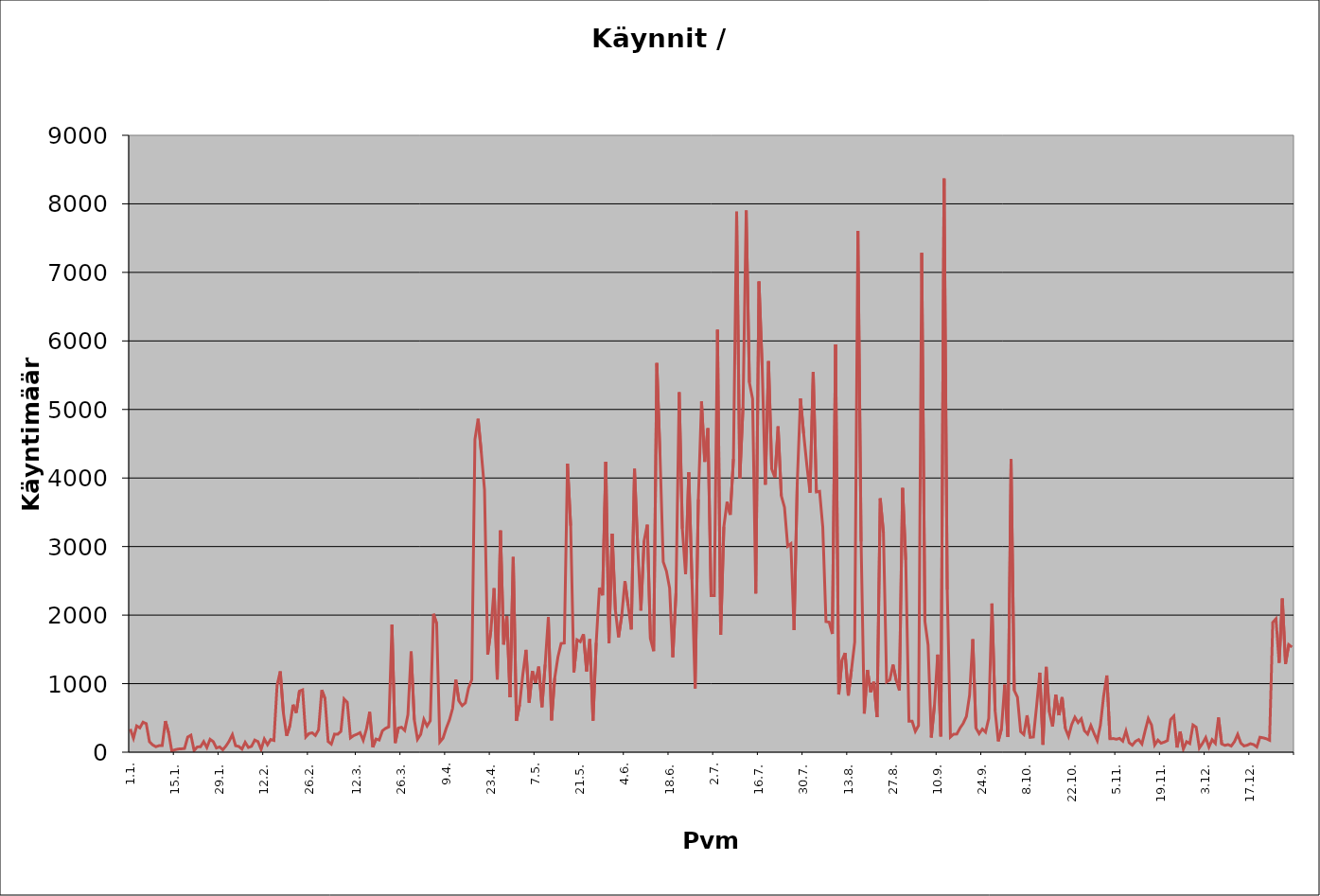
| Category | Series 1 |
|---|---|
| 0 | 338 |
| 1 | 204 |
| 2 | 383 |
| 3 | 355 |
| 4 | 438 |
| 5 | 416 |
| 6 | 154 |
| 7 | 107 |
| 8 | 80 |
| 9 | 95 |
| 10 | 96 |
| 11 | 454 |
| 12 | 286 |
| 13 | 19 |
| 14 | 35 |
| 15 | 46 |
| 16 | 49 |
| 17 | 54 |
| 18 | 221 |
| 19 | 248 |
| 20 | 25 |
| 21 | 77 |
| 22 | 79 |
| 23 | 154 |
| 24 | 68 |
| 25 | 188 |
| 26 | 154 |
| 27 | 61 |
| 28 | 77 |
| 29 | 36 |
| 30 | 91 |
| 31 | 162 |
| 32 | 256 |
| 33 | 94 |
| 34 | 84 |
| 35 | 45 |
| 36 | 144 |
| 37 | 69 |
| 38 | 86 |
| 39 | 177 |
| 40 | 155 |
| 41 | 41 |
| 42 | 192 |
| 43 | 109 |
| 44 | 185 |
| 45 | 171 |
| 46 | 975 |
| 47 | 1179 |
| 48 | 565 |
| 49 | 239 |
| 50 | 383 |
| 51 | 693 |
| 52 | 574 |
| 53 | 890 |
| 54 | 909 |
| 55 | 222 |
| 56 | 272 |
| 57 | 283 |
| 58 | 244 |
| 59 | 326 |
| 60 | 907 |
| 61 | 785 |
| 62 | 155 |
| 63 | 118 |
| 64 | 264 |
| 65 | 261 |
| 66 | 304 |
| 67 | 776 |
| 68 | 728 |
| 69 | 209 |
| 70 | 242 |
| 71 | 261 |
| 72 | 285 |
| 73 | 174 |
| 74 | 337 |
| 75 | 587 |
| 76 | 73 |
| 77 | 193 |
| 78 | 177 |
| 79 | 312 |
| 80 | 347 |
| 81 | 370 |
| 82 | 1861 |
| 83 | 134 |
| 84 | 352 |
| 85 | 364 |
| 86 | 318 |
| 87 | 548 |
| 88 | 1469 |
| 89 | 473 |
| 90 | 189 |
| 91 | 261 |
| 92 | 477 |
| 93 | 380 |
| 94 | 457 |
| 95 | 2019 |
| 96 | 1877 |
| 97 | 148 |
| 98 | 203 |
| 99 | 349 |
| 100 | 468 |
| 101 | 638 |
| 102 | 1058 |
| 103 | 747 |
| 104 | 679 |
| 105 | 718 |
| 106 | 937 |
| 107 | 1055 |
| 108 | 4565 |
| 109 | 4863 |
| 110 | 4372 |
| 111 | 3828 |
| 112 | 1423 |
| 113 | 1779 |
| 114 | 2392 |
| 115 | 1061 |
| 116 | 3233 |
| 117 | 1571 |
| 118 | 1987 |
| 119 | 800 |
| 120 | 2848 |
| 121 | 457 |
| 122 | 694 |
| 123 | 1132 |
| 124 | 1493 |
| 125 | 722 |
| 126 | 1184 |
| 127 | 1013 |
| 128 | 1247 |
| 129 | 657 |
| 130 | 1278 |
| 131 | 1972 |
| 132 | 465 |
| 133 | 1082 |
| 134 | 1387 |
| 135 | 1587 |
| 136 | 1591 |
| 137 | 4210 |
| 138 | 3305 |
| 139 | 1166 |
| 140 | 1639 |
| 141 | 1612 |
| 142 | 1721 |
| 143 | 1180 |
| 144 | 1649 |
| 145 | 461 |
| 146 | 1596 |
| 147 | 2398 |
| 148 | 2290 |
| 149 | 4236 |
| 150 | 1592 |
| 151 | 3187 |
| 152 | 2076 |
| 153 | 1677 |
| 154 | 1992 |
| 155 | 2495 |
| 156 | 2140 |
| 157 | 1792 |
| 158 | 4133 |
| 159 | 3001 |
| 160 | 2067 |
| 161 | 3081 |
| 162 | 3318 |
| 163 | 1653 |
| 164 | 1475 |
| 165 | 5677 |
| 166 | 4331 |
| 167 | 2777 |
| 168 | 2643 |
| 169 | 2394 |
| 170 | 1385 |
| 171 | 2323 |
| 172 | 5251 |
| 173 | 3259 |
| 174 | 2597 |
| 175 | 4084 |
| 176 | 2521 |
| 177 | 930 |
| 178 | 3690 |
| 179 | 5117 |
| 180 | 4235 |
| 181 | 4726 |
| 182 | 2284 |
| 183 | 2285 |
| 184 | 6163 |
| 185 | 1712 |
| 186 | 3289 |
| 187 | 3653 |
| 188 | 3464 |
| 189 | 4277 |
| 190 | 7885 |
| 191 | 3995 |
| 192 | 5033 |
| 193 | 7903 |
| 194 | 5394 |
| 195 | 5156 |
| 196 | 2315 |
| 197 | 6866 |
| 198 | 5638 |
| 199 | 3903 |
| 200 | 5705 |
| 201 | 4130 |
| 202 | 4006 |
| 203 | 4752 |
| 204 | 3742 |
| 205 | 3572 |
| 206 | 3005 |
| 207 | 3041 |
| 208 | 1780 |
| 209 | 3934 |
| 210 | 5161 |
| 211 | 4649 |
| 212 | 4189 |
| 213 | 3786 |
| 214 | 5547 |
| 215 | 3797 |
| 216 | 3807 |
| 217 | 3280 |
| 218 | 1904 |
| 219 | 1896 |
| 220 | 1724 |
| 221 | 5949 |
| 222 | 842 |
| 223 | 1339 |
| 224 | 1447 |
| 225 | 826 |
| 226 | 1207 |
| 227 | 1607 |
| 228 | 7606 |
| 229 | 3074 |
| 230 | 563 |
| 231 | 1200 |
| 232 | 876 |
| 233 | 1028 |
| 234 | 511 |
| 235 | 3703 |
| 236 | 3205 |
| 237 | 1025 |
| 238 | 1054 |
| 239 | 1277 |
| 240 | 1050 |
| 241 | 900 |
| 242 | 3854 |
| 243 | 2803 |
| 244 | 452 |
| 245 | 452 |
| 246 | 304 |
| 247 | 390 |
| 248 | 7284 |
| 249 | 1908 |
| 250 | 1564 |
| 251 | 214 |
| 252 | 687 |
| 253 | 1423 |
| 254 | 230 |
| 255 | 8370 |
| 256 | 2370 |
| 257 | 221 |
| 258 | 263 |
| 259 | 265 |
| 260 | 352 |
| 261 | 421 |
| 262 | 521 |
| 263 | 832 |
| 264 | 1648 |
| 265 | 351 |
| 266 | 271 |
| 267 | 338 |
| 268 | 292 |
| 269 | 494 |
| 270 | 2169 |
| 271 | 602 |
| 272 | 159 |
| 273 | 342 |
| 274 | 986 |
| 275 | 222 |
| 276 | 4274 |
| 277 | 902 |
| 278 | 802 |
| 279 | 300 |
| 280 | 257 |
| 281 | 539 |
| 282 | 217 |
| 283 | 222 |
| 284 | 674 |
| 285 | 1160 |
| 286 | 108 |
| 287 | 1244 |
| 288 | 584 |
| 289 | 375 |
| 290 | 839 |
| 291 | 539 |
| 292 | 803 |
| 293 | 348 |
| 294 | 231 |
| 295 | 404 |
| 296 | 510 |
| 297 | 432 |
| 298 | 487 |
| 299 | 312 |
| 300 | 264 |
| 301 | 389 |
| 302 | 274 |
| 303 | 169 |
| 304 | 397 |
| 305 | 819 |
| 306 | 1119 |
| 307 | 196 |
| 308 | 199 |
| 309 | 189 |
| 310 | 202 |
| 311 | 161 |
| 312 | 309 |
| 313 | 138 |
| 314 | 102 |
| 315 | 159 |
| 316 | 183 |
| 317 | 120 |
| 318 | 311 |
| 319 | 491 |
| 320 | 399 |
| 321 | 105 |
| 322 | 176 |
| 323 | 131 |
| 324 | 147 |
| 325 | 170 |
| 326 | 476 |
| 327 | 527 |
| 328 | 68 |
| 329 | 302 |
| 330 | 47 |
| 331 | 153 |
| 332 | 126 |
| 333 | 397 |
| 334 | 365 |
| 335 | 61 |
| 336 | 130 |
| 337 | 213 |
| 338 | 74 |
| 339 | 182 |
| 340 | 129 |
| 341 | 506 |
| 342 | 121 |
| 343 | 99 |
| 344 | 111 |
| 345 | 90 |
| 346 | 154 |
| 347 | 260 |
| 348 | 132 |
| 349 | 91 |
| 350 | 102 |
| 351 | 124 |
| 352 | 111 |
| 353 | 77 |
| 354 | 218 |
| 355 | 209 |
| 356 | 196 |
| 357 | 174 |
| 358 | 1893 |
| 359 | 1946 |
| 360 | 1304 |
| 361 | 2241 |
| 362 | 1287 |
| 363 | 1569 |
| 364 | 1533 |